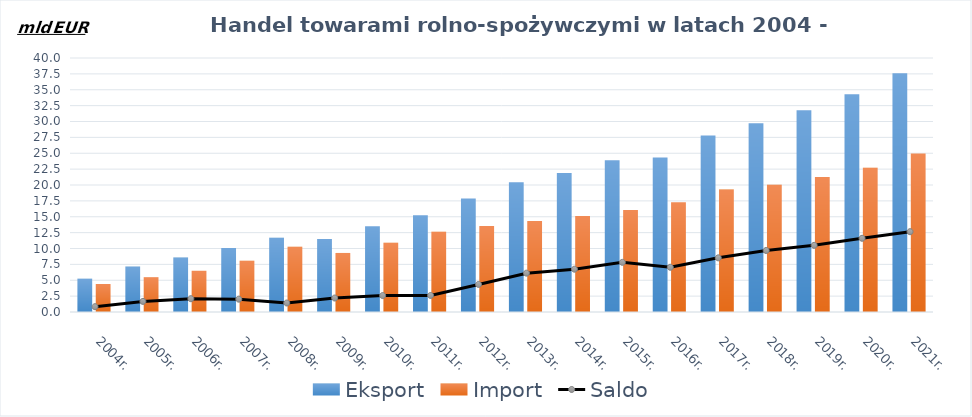
| Category | Eksport | Import |
|---|---|---|
| 2004r. | 5.242 | 4.406 |
| 2005r. | 7.152 | 5.485 |
| 2006r. | 8.577 | 6.486 |
| 2007r. | 10.089 | 8.07 |
| 2008r. | 11.692 | 10.277 |
| 2009r. | 11.499 | 9.299 |
| 2010r. | 13.507 | 10.921 |
| 2011r. | 15.228 | 12.628 |
| 2012r. | 17.893 | 13.557 |
| 2013r. | 20.427 | 14.313 |
| 2014r. | 21.876 | 15.134 |
| 2015r. | 23.887 | 16.068 |
| 2016r. | 24.332 | 17.292 |
| 2017r. | 27.813 | 19.285 |
| 2018r. | 29.717 | 20.033 |
| 2019r. | 31.766 | 21.27 |
| 2020r. | 34.31 | 22.703 |
| 2021r. | 37.611 | 24.967 |